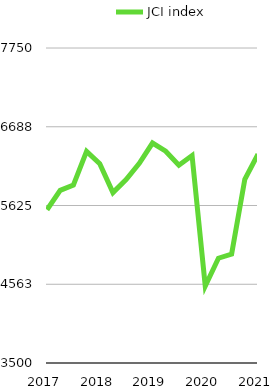
| Category | JCI index |
|---|---|
| 2017 | 5568 |
|  | 5829 |
|  | 5900 |
|  | 6355 |
| 2018 | 6188 |
|  | 5799 |
|  | 5976 |
|  | 6194 |
| 2019 | 6468 |
|  | 6358 |
|  | 6169 |
|  | 6299 |
| 2020 | 4538 |
|  | 4914 |
|  | 4970 |
|  | 5979 |
| 2021 | 6316 |